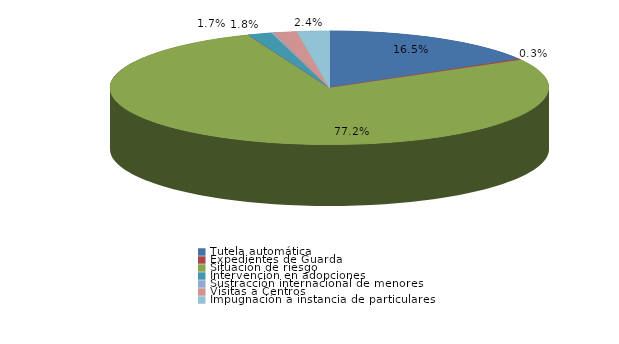
| Category | Series 0 |
|---|---|
| Tutela automática | 167 |
| Expedientes de Guarda | 3 |
| Situación de riesgo | 783 |
| Intervención en acogimientos | 0 |
| Intervención en adopciones | 18 |
| Defensa de los derechos fundamentales | 0 |
| Sustracción internacional de menores | 2 |
| Visitas a Centros | 17 |
| Ensayos Clínicos | 0 |
| Impugnación a instacia del Fiscal | 0 |
| Impugnación a instancia de particulares | 24 |